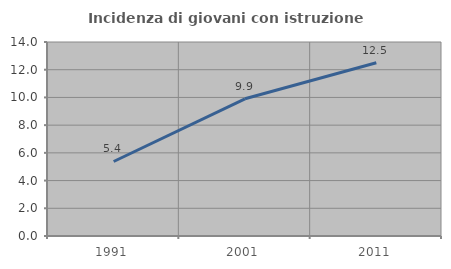
| Category | Incidenza di giovani con istruzione universitaria |
|---|---|
| 1991.0 | 5.376 |
| 2001.0 | 9.901 |
| 2011.0 | 12.5 |